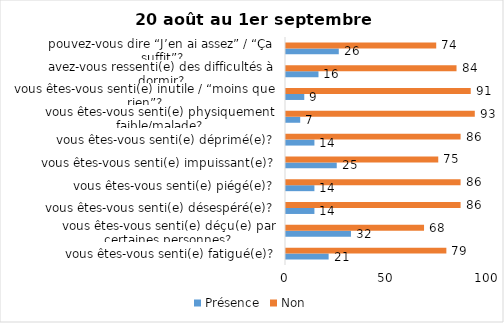
| Category | Présence | Non |
|---|---|---|
| vous êtes-vous senti(e) fatigué(e)? | 21 | 79 |
| vous êtes-vous senti(e) déçu(e) par certaines personnes? | 32 | 68 |
| vous êtes-vous senti(e) désespéré(e)? | 14 | 86 |
| vous êtes-vous senti(e) piégé(e)? | 14 | 86 |
| vous êtes-vous senti(e) impuissant(e)? | 25 | 75 |
| vous êtes-vous senti(e) déprimé(e)? | 14 | 86 |
| vous êtes-vous senti(e) physiquement faible/malade? | 7 | 93 |
| vous êtes-vous senti(e) inutile / “moins que rien”? | 9 | 91 |
| avez-vous ressenti(e) des difficultés à dormir? | 16 | 84 |
| pouvez-vous dire “J’en ai assez” / “Ça suffit”? | 26 | 74 |